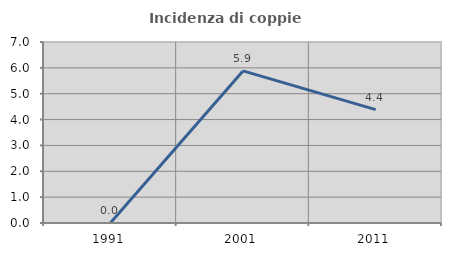
| Category | Incidenza di coppie miste |
|---|---|
| 1991.0 | 0 |
| 2001.0 | 5.882 |
| 2011.0 | 4.386 |